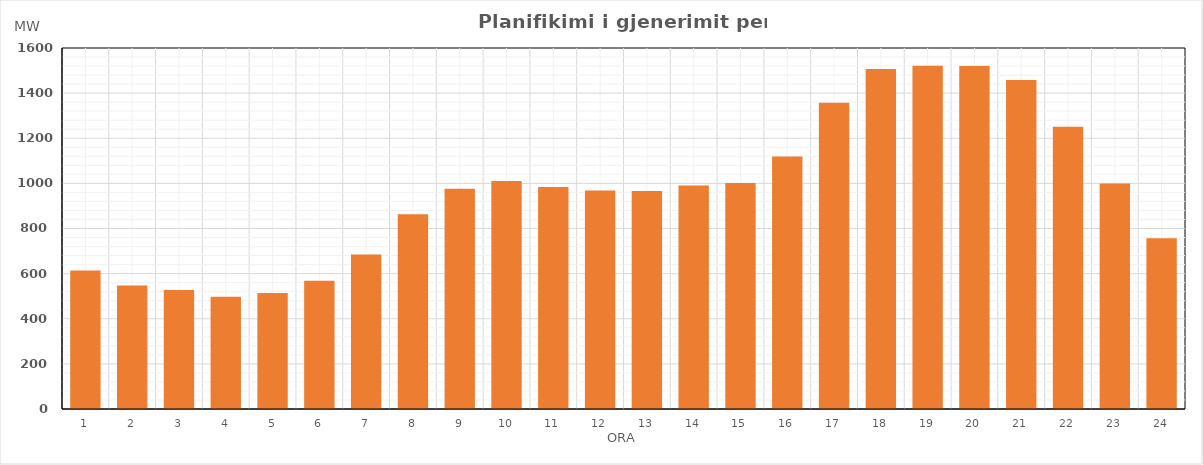
| Category | Max (MW) |
|---|---|
| 0 | 613.91 |
| 1 | 547.82 |
| 2 | 527.56 |
| 3 | 497.36 |
| 4 | 514.24 |
| 5 | 568.62 |
| 6 | 684.86 |
| 7 | 863.05 |
| 8 | 976.11 |
| 9 | 1010.42 |
| 10 | 983.45 |
| 11 | 968.55 |
| 12 | 966.74 |
| 13 | 990.56 |
| 14 | 1001.41 |
| 15 | 1119.63 |
| 16 | 1357.81 |
| 17 | 1507.31 |
| 18 | 1521.24 |
| 19 | 1520.18 |
| 20 | 1457.75 |
| 21 | 1250.57 |
| 22 | 999.19 |
| 23 | 756.93 |